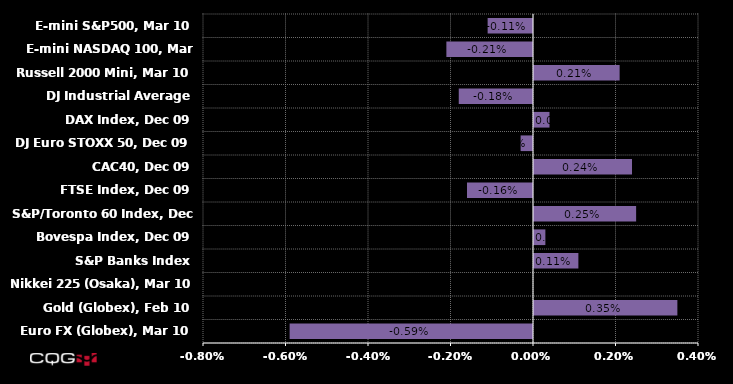
| Category | Series 0 | Series 1 | Series 2 | Series 3 |
|---|---|---|---|---|
| Euro FX (Globex), Mar 10 |  |  |  | -0.006 |
| Gold (Globex), Feb 10 |  |  |  | 0.003 |
| Nikkei 225 (Osaka), Mar 10 |  |  |  | 0 |
| S&P Banks Index |  |  |  | 0.001 |
| Bovespa Index, Dec 09 |  |  |  | 0 |
| S&P/Toronto 60 Index, Dec 09 |  |  |  | 0.003 |
| FTSE Index, Dec 09 |  |  |  | -0.002 |
| CAC40, Dec 09 |  |  |  | 0.002 |
| DJ Euro STOXX 50, Dec 09 |  |  |  | 0 |
| DAX Index, Dec 09 |  |  |  | 0 |
| DJ Industrial Average |  |  |  | -0.002 |
| Russell 2000 Mini, Mar 10 |  |  |  | 0.002 |
| E-mini NASDAQ 100, Mar 10 |  |  |  | -0.002 |
| E-mini S&P500, Mar 10 |  |  |  | -0.001 |